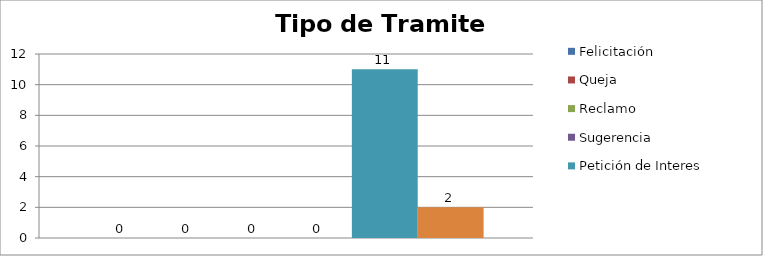
| Category | Felicitación | Queja | Reclamo | Sugerencia | Petición de Interes General | Petición de Interes Particular |
|---|---|---|---|---|---|---|
| 0 | 0 | 0 | 0 | 0 | 11 | 2 |